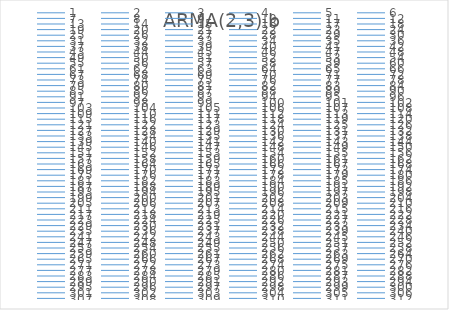
| Category | ARMA(2,3) b |
|---|---|
| 0 | 0 |
| 1 | 7.794 |
| 2 | 12.601 |
| 3 | 18.109 |
| 4 | 22.146 |
| 5 | 26.549 |
| 6 | 33.078 |
| 7 | 38.893 |
| 8 | 44.201 |
| 9 | 51.469 |
| 10 | 58.474 |
| 11 | 63.171 |
| 12 | 69.413 |
| 13 | 75.867 |
| 14 | 80.87 |
| 15 | 86.041 |
| 16 | 91.63 |
| 17 | 95.302 |
| 18 | 98.312 |
| 19 | 101.758 |
| 20 | 104.089 |
| 21 | 106.527 |
| 22 | 108.618 |
| 23 | 109.838 |
| 24 | 110.77 |
| 25 | 112.248 |
| 26 | 113.088 |
| 27 | 112.694 |
| 28 | 112.826 |
| 29 | 112.469 |
| 30 | 113.015 |
| 31 | 113.544 |
| 32 | 112.494 |
| 33 | 110.931 |
| 34 | 110.83 |
| 35 | 112.4 |
| 36 | 114.393 |
| 37 | 116.797 |
| 38 | 120.16 |
| 39 | 121.974 |
| 40 | 121.574 |
| 41 | 121.356 |
| 42 | 121.762 |
| 43 | 119.991 |
| 44 | 120.241 |
| 45 | 120.675 |
| 46 | 121.054 |
| 47 | 121.037 |
| 48 | 123.033 |
| 49 | 123.679 |
| 50 | 124.995 |
| 51 | 126.361 |
| 52 | 126.485 |
| 53 | 124.791 |
| 54 | 124.548 |
| 55 | 124.074 |
| 56 | 123.307 |
| 57 | 123.682 |
| 58 | 123.542 |
| 59 | 123.829 |
| 60 | 122.208 |
| 61 | 121.525 |
| 62 | 120.184 |
| 63 | 117.533 |
| 64 | 117.433 |
| 65 | 115.297 |
| 66 | 116.336 |
| 67 | 115.492 |
| 68 | 114.591 |
| 69 | 115.812 |
| 70 | 115.292 |
| 71 | 115.949 |
| 72 | 115.688 |
| 73 | 115.859 |
| 74 | 116.993 |
| 75 | 118.03 |
| 76 | 119.84 |
| 77 | 120.494 |
| 78 | 121.77 |
| 79 | 122.056 |
| 80 | 123.075 |
| 81 | 123.571 |
| 82 | 123.347 |
| 83 | 123.931 |
| 84 | 124.618 |
| 85 | 125.106 |
| 86 | 126.121 |
| 87 | 125.578 |
| 88 | 125.91 |
| 89 | 125.132 |
| 90 | 124.648 |
| 91 | 121.895 |
| 92 | 122.231 |
| 93 | 122.572 |
| 94 | 121.706 |
| 95 | 122.319 |
| 96 | 121.336 |
| 97 | 121.028 |
| 98 | 120.953 |
| 99 | 124.075 |
| 100 | 123.636 |
| 101 | 123.653 |
| 102 | 122.861 |
| 103 | 121.36 |
| 104 | 119.894 |
| 105 | 117.62 |
| 106 | 115.794 |
| 107 | 115.525 |
| 108 | 114.722 |
| 109 | 114.126 |
| 110 | 112.552 |
| 111 | 111.17 |
| 112 | 109.366 |
| 113 | 109.581 |
| 114 | 110.356 |
| 115 | 109.305 |
| 116 | 110.306 |
| 117 | 109.061 |
| 118 | 110.131 |
| 119 | 111.14 |
| 120 | 111.816 |
| 121 | 114.107 |
| 122 | 115.211 |
| 123 | 116.861 |
| 124 | 118.973 |
| 125 | 118.905 |
| 126 | 121.391 |
| 127 | 120.227 |
| 128 | 118.396 |
| 129 | 116.398 |
| 130 | 115.27 |
| 131 | 115.648 |
| 132 | 115.652 |
| 133 | 115.847 |
| 134 | 116.149 |
| 135 | 115.657 |
| 136 | 115.757 |
| 137 | 117.059 |
| 138 | 116.771 |
| 139 | 117.161 |
| 140 | 119.171 |
| 141 | 121.527 |
| 142 | 123.039 |
| 143 | 124.68 |
| 144 | 126.601 |
| 145 | 123.693 |
| 146 | 122.664 |
| 147 | 123.683 |
| 148 | 121.777 |
| 149 | 122.324 |
| 150 | 123.103 |
| 151 | 122.377 |
| 152 | 123.583 |
| 153 | 125.19 |
| 154 | 125.362 |
| 155 | 125.328 |
| 156 | 123.135 |
| 157 | 121.62 |
| 158 | 120.489 |
| 159 | 118.461 |
| 160 | 117.998 |
| 161 | 118 |
| 162 | 118.43 |
| 163 | 118.538 |
| 164 | 119.746 |
| 165 | 120.301 |
| 166 | 121.145 |
| 167 | 122.946 |
| 168 | 124.155 |
| 169 | 124.267 |
| 170 | 125.149 |
| 171 | 124.952 |
| 172 | 126.413 |
| 173 | 127.546 |
| 174 | 126.958 |
| 175 | 126.422 |
| 176 | 126.544 |
| 177 | 124.071 |
| 178 | 124.299 |
| 179 | 124.229 |
| 180 | 122.529 |
| 181 | 120.96 |
| 182 | 117.45 |
| 183 | 116.56 |
| 184 | 113.895 |
| 185 | 112.845 |
| 186 | 113.186 |
| 187 | 111.734 |
| 188 | 110.982 |
| 189 | 111.182 |
| 190 | 110.678 |
| 191 | 109.921 |
| 192 | 108.999 |
| 193 | 106.5 |
| 194 | 106.129 |
| 195 | 106.135 |
| 196 | 106.786 |
| 197 | 107.285 |
| 198 | 109.819 |
| 199 | 109.49 |
| 200 | 108.977 |
| 201 | 110.104 |
| 202 | 110.409 |
| 203 | 110.159 |
| 204 | 109.519 |
| 205 | 110.05 |
| 206 | 110.623 |
| 207 | 111.868 |
| 208 | 113.916 |
| 209 | 116.351 |
| 210 | 117.343 |
| 211 | 118.997 |
| 212 | 119.939 |
| 213 | 119.2 |
| 214 | 119.301 |
| 215 | 119.084 |
| 216 | 117.701 |
| 217 | 117.953 |
| 218 | 119.649 |
| 219 | 118.736 |
| 220 | 120.016 |
| 221 | 121.4 |
| 222 | 120.299 |
| 223 | 120.507 |
| 224 | 120.857 |
| 225 | 120.347 |
| 226 | 120.165 |
| 227 | 121.004 |
| 228 | 120.605 |
| 229 | 121.782 |
| 230 | 120.247 |
| 231 | 118.56 |
| 232 | 116.515 |
| 233 | 116.204 |
| 234 | 117.038 |
| 235 | 119.377 |
| 236 | 122.018 |
| 237 | 124.225 |
| 238 | 125.103 |
| 239 | 124.277 |
| 240 | 126.613 |
| 241 | 127.018 |
| 242 | 128.012 |
| 243 | 126.908 |
| 244 | 127.999 |
| 245 | 127.761 |
| 246 | 128.337 |
| 247 | 130.012 |
| 248 | 131.361 |
| 249 | 131.151 |
| 250 | 133.343 |
| 251 | 133.544 |
| 252 | 135.409 |
| 253 | 134.912 |
| 254 | 133.345 |
| 255 | 131.48 |
| 256 | 129.031 |
| 257 | 127.391 |
| 258 | 126.436 |
| 259 | 124.866 |
| 260 | 123.826 |
| 261 | 124.276 |
| 262 | 123.52 |
| 263 | 124.902 |
| 264 | 125.259 |
| 265 | 125.051 |
| 266 | 124.526 |
| 267 | 125.185 |
| 268 | 124.138 |
| 269 | 122.043 |
| 270 | 121.053 |
| 271 | 119.954 |
| 272 | 119.486 |
| 273 | 120.226 |
| 274 | 122.163 |
| 275 | 123.164 |
| 276 | 124.634 |
| 277 | 126.279 |
| 278 | 126.75 |
| 279 | 126.08 |
| 280 | 126.303 |
| 281 | 124.937 |
| 282 | 125.858 |
| 283 | 125.297 |
| 284 | 124.048 |
| 285 | 123.873 |
| 286 | 124.057 |
| 287 | 124.311 |
| 288 | 124.981 |
| 289 | 126.419 |
| 290 | 126.705 |
| 291 | 127.722 |
| 292 | 127.742 |
| 293 | 127.042 |
| 294 | 124.489 |
| 295 | 122.405 |
| 296 | 121.837 |
| 297 | 121.688 |
| 298 | 121.488 |
| 299 | 121.333 |
| 300 | 119.467 |
| 301 | 116.067 |
| 302 | 114.545 |
| 303 | 111.973 |
| 304 | 110.836 |
| 305 | 110.45 |
| 306 | 110.898 |
| 307 | 111.593 |
| 308 | 111.919 |
| 309 | 112.318 |
| 310 | 113.832 |
| 311 | 114.865 |
| 312 | 116.822 |
| 313 | 118.549 |
| 314 | 119.953 |
| 315 | 122.284 |
| 316 | 124.229 |
| 317 | 124.344 |
| 318 | 125.92 |
| 319 | 126.596 |
| 320 | 127.114 |
| 321 | 128.586 |
| 322 | 129.355 |
| 323 | 129.522 |
| 324 | 128.969 |
| 325 | 127.594 |
| 326 | 127.299 |
| 327 | 127.785 |
| 328 | 128.049 |
| 329 | 129.548 |
| 330 | 129.196 |
| 331 | 129.529 |
| 332 | 128.474 |
| 333 | 128.016 |
| 334 | 126.194 |
| 335 | 123.597 |
| 336 | 122.666 |
| 337 | 121.789 |
| 338 | 120.546 |
| 339 | 121.29 |
| 340 | 122.171 |
| 341 | 120.712 |
| 342 | 119.277 |
| 343 | 119.183 |
| 344 | 117.927 |
| 345 | 117.359 |
| 346 | 116.961 |
| 347 | 118.511 |
| 348 | 120.09 |
| 349 | 122.461 |
| 350 | 123.537 |
| 351 | 122.732 |
| 352 | 123.363 |
| 353 | 122.175 |
| 354 | 122.859 |
| 355 | 124.515 |
| 356 | 124.914 |
| 357 | 126.114 |
| 358 | 126.946 |
| 359 | 128.515 |
| 360 | 128.605 |
| 361 | 130.029 |
| 362 | 131.547 |
| 363 | 131.094 |
| 364 | 129.822 |
| 365 | 130.086 |
| 366 | 129.44 |
| 367 | 127.66 |
| 368 | 127.677 |
| 369 | 126.39 |
| 370 | 124.593 |
| 371 | 125.114 |
| 372 | 123.935 |
| 373 | 123.64 |
| 374 | 123.824 |
| 375 | 122.916 |
| 376 | 122.207 |
| 377 | 121.908 |
| 378 | 122.731 |
| 379 | 123.216 |
| 380 | 122.842 |
| 381 | 122.568 |
| 382 | 121.305 |
| 383 | 121.043 |
| 384 | 120.556 |
| 385 | 120.403 |
| 386 | 120.236 |
| 387 | 119.384 |
| 388 | 119.753 |
| 389 | 119.717 |
| 390 | 122.527 |
| 391 | 124.538 |
| 392 | 125.537 |
| 393 | 126.312 |
| 394 | 126.77 |
| 395 | 126.098 |
| 396 | 129.461 |
| 397 | 130.675 |
| 398 | 130.56 |
| 399 | 132.343 |
| 400 | 132.44 |
| 401 | 131.999 |
| 402 | 131.6 |
| 403 | 130.657 |
| 404 | 131.589 |
| 405 | 131.283 |
| 406 | 132.382 |
| 407 | 131.407 |
| 408 | 129.761 |
| 409 | 129.16 |
| 410 | 126.535 |
| 411 | 126.329 |
| 412 | 125.443 |
| 413 | 126.291 |
| 414 | 128.567 |
| 415 | 128.635 |
| 416 | 128.452 |
| 417 | 127.006 |
| 418 | 124.936 |
| 419 | 124.106 |
| 420 | 123.758 |
| 421 | 124.953 |
| 422 | 125.575 |
| 423 | 125.002 |
| 424 | 126.012 |
| 425 | 126.391 |
| 426 | 126.552 |
| 427 | 129.491 |
| 428 | 129.239 |
| 429 | 130.9 |
| 430 | 129.462 |
| 431 | 129.628 |
| 432 | 130.63 |
| 433 | 129.426 |
| 434 | 131.772 |
| 435 | 131.27 |
| 436 | 129.313 |
| 437 | 129.138 |
| 438 | 126.198 |
| 439 | 126.152 |
| 440 | 126.576 |
| 441 | 126.484 |
| 442 | 126.915 |
| 443 | 127.753 |
| 444 | 127.654 |
| 445 | 128.068 |
| 446 | 129.269 |
| 447 | 128.764 |
| 448 | 128.442 |
| 449 | 129.342 |
| 450 | 129.435 |
| 451 | 130.318 |
| 452 | 129.503 |
| 453 | 127.116 |
| 454 | 125.593 |
| 455 | 124.737 |
| 456 | 125.279 |
| 457 | 126.774 |
| 458 | 128.801 |
| 459 | 128.101 |
| 460 | 125.378 |
| 461 | 124.012 |
| 462 | 123.441 |
| 463 | 124.438 |
| 464 | 124.967 |
| 465 | 123.68 |
| 466 | 123.299 |
| 467 | 121.645 |
| 468 | 119.981 |
| 469 | 118.97 |
| 470 | 118.528 |
| 471 | 117.94 |
| 472 | 116.598 |
| 473 | 116.65 |
| 474 | 117.223 |
| 475 | 117.944 |
| 476 | 118.629 |
| 477 | 119.391 |
| 478 | 118.45 |
| 479 | 120.211 |
| 480 | 120.475 |
| 481 | 120.79 |
| 482 | 121.525 |
| 483 | 121.431 |
| 484 | 121.036 |
| 485 | 121.654 |
| 486 | 120.589 |
| 487 | 119.318 |
| 488 | 119.064 |
| 489 | 117.298 |
| 490 | 116.863 |
| 491 | 115.871 |
| 492 | 114.656 |
| 493 | 113.26 |
| 494 | 111.279 |
| 495 | 110.071 |
| 496 | 109.638 |
| 497 | 110.135 |
| 498 | 110.452 |
| 499 | 112.343 |
| 500 | 113.272 |
| 501 | 113.23 |
| 502 | 114.362 |
| 503 | 114.599 |
| 504 | 114.372 |
| 505 | 114.822 |
| 506 | 114.269 |
| 507 | 113.248 |
| 508 | 112.239 |
| 509 | 111.246 |
| 510 | 111.264 |
| 511 | 112.219 |
| 512 | 111.354 |
| 513 | 111.904 |
| 514 | 111.848 |
| 515 | 112.072 |
| 516 | 113.5 |
| 517 | 114.143 |
| 518 | 115.975 |
| 519 | 118.078 |
| 520 | 117.382 |
| 521 | 117.824 |
| 522 | 116.238 |
| 523 | 115.392 |
| 524 | 115.903 |
| 525 | 114.666 |
| 526 | 116.138 |
| 527 | 115.31 |
| 528 | 115.242 |
| 529 | 115.954 |
| 530 | 118.207 |
| 531 | 119.938 |
| 532 | 122.184 |
| 533 | 122.404 |
| 534 | 122.398 |
| 535 | 122.034 |
| 536 | 122.445 |
| 537 | 124.475 |
| 538 | 126.416 |
| 539 | 128.529 |
| 540 | 129.859 |
| 541 | 129.823 |
| 542 | 130.226 |
| 543 | 129.671 |
| 544 | 130.005 |
| 545 | 129.771 |
| 546 | 126.889 |
| 547 | 124.271 |
| 548 | 123.847 |
| 549 | 122.358 |
| 550 | 122.618 |
| 551 | 123.432 |
| 552 | 123.719 |
| 553 | 123.616 |
| 554 | 122.892 |
| 555 | 122.97 |
| 556 | 120.26 |
| 557 | 119.622 |
| 558 | 119.826 |
| 559 | 118.902 |
| 560 | 117.244 |
| 561 | 115.068 |
| 562 | 112.94 |
| 563 | 111.658 |
| 564 | 110.814 |
| 565 | 110.576 |
| 566 | 110.905 |
| 567 | 111.478 |
| 568 | 109.892 |
| 569 | 110.603 |
| 570 | 109.892 |
| 571 | 109.6 |
| 572 | 109.809 |
| 573 | 109.695 |
| 574 | 108.928 |
| 575 | 109.506 |
| 576 | 109.787 |
| 577 | 110.419 |
| 578 | 111.749 |
| 579 | 112.267 |
| 580 | 113.987 |
| 581 | 115.1 |
| 582 | 116.419 |
| 583 | 116.479 |
| 584 | 116.722 |
| 585 | 117.718 |
| 586 | 118.531 |
| 587 | 119.15 |
| 588 | 120.297 |
| 589 | 120.895 |
| 590 | 121.666 |
| 591 | 122.292 |
| 592 | 122.251 |
| 593 | 123.548 |
| 594 | 123.205 |
| 595 | 124.001 |
| 596 | 122.84 |
| 597 | 121.536 |
| 598 | 121.815 |
| 599 | 122.939 |
| 600 | 125.529 |